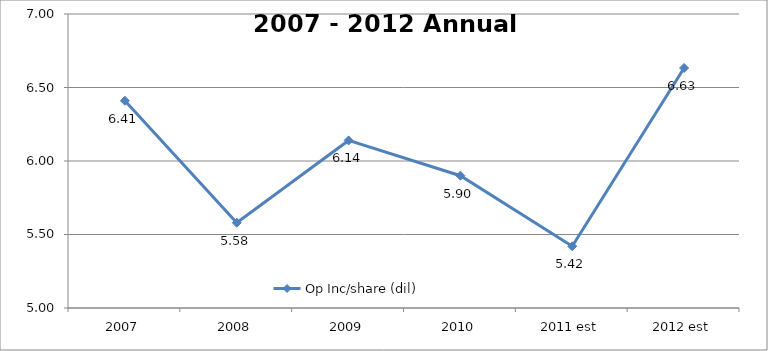
| Category | Op Inc/share (dil) |
|---|---|
| 2007 | 6.41 |
| 2008 | 5.58 |
| 2009 | 6.14 |
| 2010 | 5.9 |
| 2011 est | 5.42 |
| 2012 est | 6.633 |